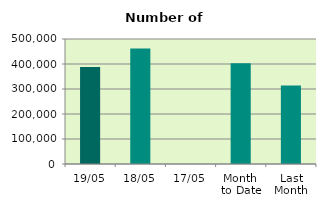
| Category | Series 0 |
|---|---|
| 19/05 | 387884 |
| 18/05 | 462102 |
| 17/05 | 0 |
| Month 
to Date | 403161.538 |
| Last
Month | 313751.158 |